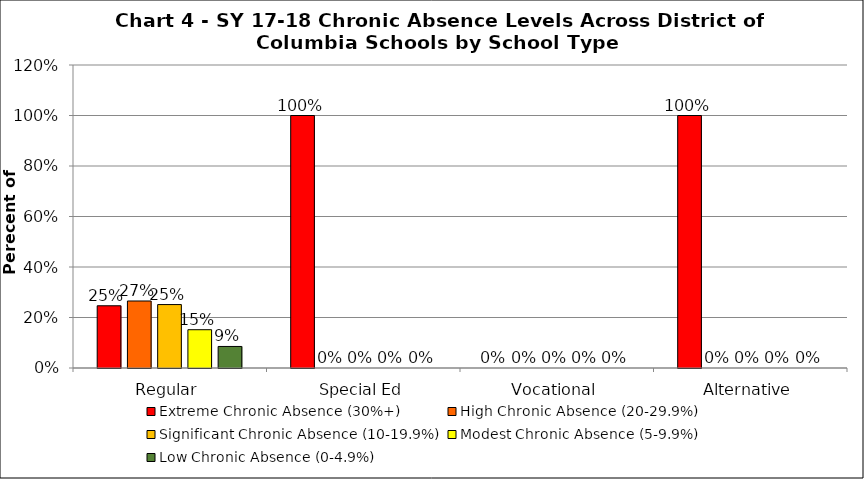
| Category | Extreme Chronic Absence (30%+) | High Chronic Absence (20-29.9%) | Significant Chronic Absence (10-19.9%) | Modest Chronic Absence (5-9.9%) | Low Chronic Absence (0-4.9%) |
|---|---|---|---|---|---|
| 0 | 0.246 | 0.265 | 0.251 | 0.152 | 0.085 |
| 1 | 1 | 0 | 0 | 0 | 0 |
| 2 | 0 | 0 | 0 | 0 | 0 |
| 3 | 1 | 0 | 0 | 0 | 0 |